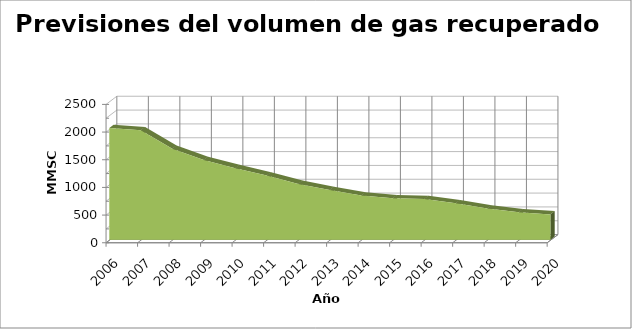
| Category | MMSCF 2018,45 1974,65 1642,5 1438,1 1292,1 1160,7 1007,4 897,9 799,35 748,25 733,65 657 562,1 496,4 456,25 |
|---|---|
| 2006.0 | 2018.45 |
| 2007.0 | 1974.65 |
| 2008.0 | 1642.5 |
| 2009.0 | 1438.1 |
| 2010.0 | 1292.1 |
| 2011.0 | 1160.7 |
| 2012.0 | 1007.4 |
| 2013.0 | 897.9 |
| 2014.0 | 799.35 |
| 2015.0 | 748.25 |
| 2016.0 | 733.65 |
| 2017.0 | 657 |
| 2018.0 | 562.1 |
| 2019.0 | 496.4 |
| 2020.0 | 456.25 |